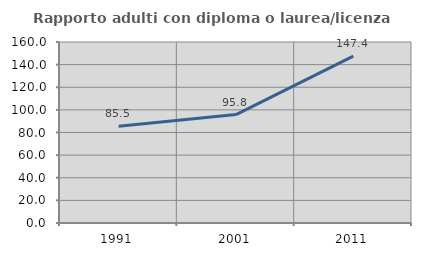
| Category | Rapporto adulti con diploma o laurea/licenza media  |
|---|---|
| 1991.0 | 85.455 |
| 2001.0 | 95.833 |
| 2011.0 | 147.436 |